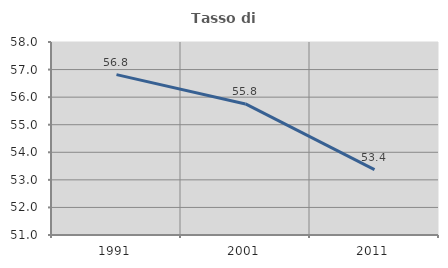
| Category | Tasso di occupazione   |
|---|---|
| 1991.0 | 56.816 |
| 2001.0 | 55.754 |
| 2011.0 | 53.371 |